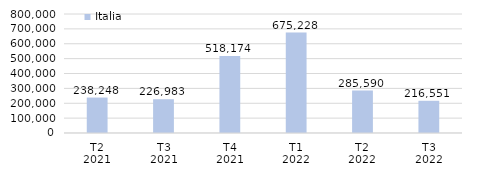
| Category | Italia |
|---|---|
| T2
2021 | 238247.791 |
| T3
2021 | 226983 |
| T4
2021 | 518173.522 |
| T1
2022 | 675227.656 |
| T2
2022 | 285590.495 |
| T3
2022 | 216551.348 |